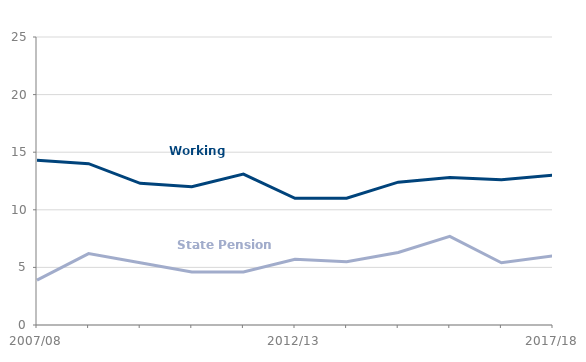
| Category | Working age | State Pension age |
|---|---|---|
| 2007/08 | 14300 | 3900 |
| 2008/09 | 14000 | 6200 |
| 2009/10 | 12300 | 5400 |
| 2010/11 | 12000 | 4600 |
| 2011/12 | 13100 | 4600 |
| 2012/13 | 11000 | 5700 |
| 2013/14 | 11000 | 5500 |
| 2014/15 | 12400 | 6300 |
| 2015/16 | 12800 | 7700 |
| 2016/17 | 12600 | 5400 |
| 2017/18 | 13000 | 6000 |